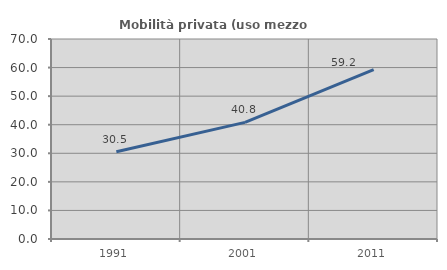
| Category | Mobilità privata (uso mezzo privato) |
|---|---|
| 1991.0 | 30.537 |
| 2001.0 | 40.809 |
| 2011.0 | 59.247 |